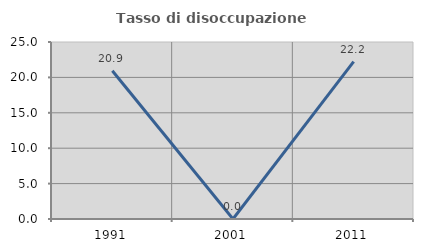
| Category | Tasso di disoccupazione giovanile  |
|---|---|
| 1991.0 | 20.93 |
| 2001.0 | 0 |
| 2011.0 | 22.222 |